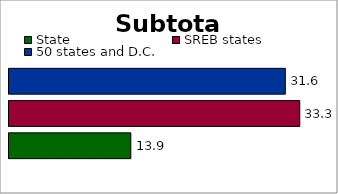
| Category | State | SREB states | 50 states and D.C. |
|---|---|---|---|
| 0 | 13.933 | 33.257 | 31.605 |